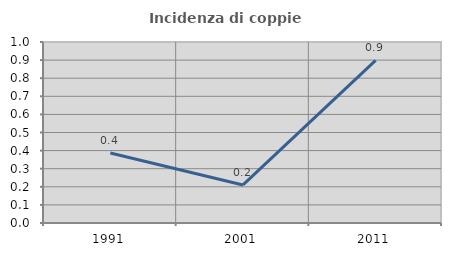
| Category | Incidenza di coppie miste |
|---|---|
| 1991.0 | 0.386 |
| 2001.0 | 0.21 |
| 2011.0 | 0.899 |